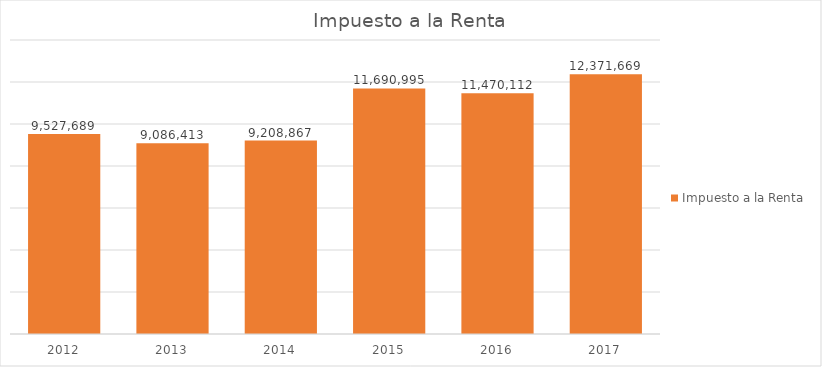
| Category | Impuesto a la Renta |
|---|---|
| 2012.0 | 9527689.258 |
| 2013.0 | 9086413.099 |
| 2014.0 | 9208866.697 |
| 2015.0 | 11690994.952 |
| 2016.0 | 11470112.056 |
| 2017.0 | 12371669.011 |